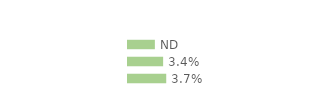
| Category | Series 0 |
|---|---|
| Immigrées | 0.026 |
| Descendantes d'immigré(s) | 0.034 |
| Ni immigrées, ni descendantes | 0.037 |